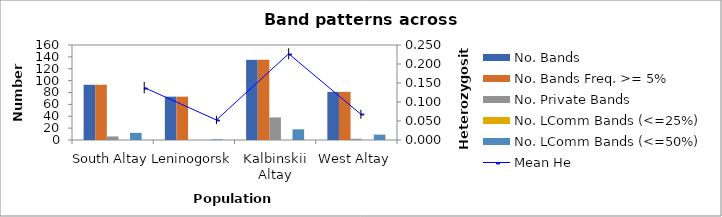
| Category | No. Bands | No. Bands Freq. >= 5% | No. Private Bands | No. LComm Bands (<=25%) | No. LComm Bands (<=50%) |
|---|---|---|---|---|---|
| South Altay | 93 | 93 | 6 | 0 | 12 |
| Leninogorsk | 73 | 73 | 0 | 0 | 1 |
| Kalbinskii Altay | 135 | 135 | 38 | 0 | 18 |
| West Altay | 81 | 81 | 2 | 0 | 9 |